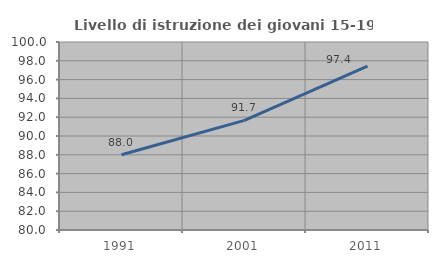
| Category | Livello di istruzione dei giovani 15-19 anni |
|---|---|
| 1991.0 | 88 |
| 2001.0 | 91.667 |
| 2011.0 | 97.436 |